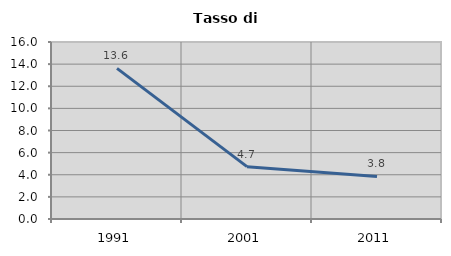
| Category | Tasso di disoccupazione   |
|---|---|
| 1991.0 | 13.613 |
| 2001.0 | 4.73 |
| 2011.0 | 3.846 |